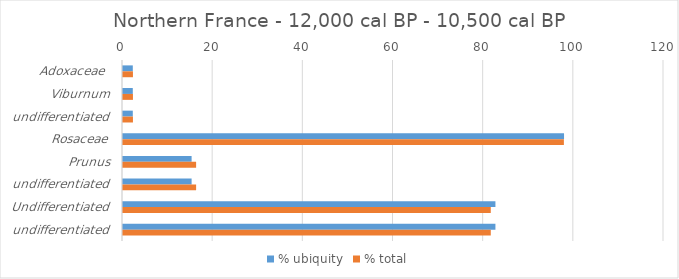
| Category | % ubiquity | % total |
|---|---|---|
| Adoxaceae  | 2.174 | 2.206 |
| Viburnum | 2.174 | 2.206 |
| undifferentiated | 2.174 | 2.206 |
| Rosaceae | 97.826 | 97.794 |
| Prunus | 15.217 | 16.217 |
| undifferentiated | 15.217 | 16.217 |
| Undifferentiated | 82.609 | 81.577 |
| undifferentiated | 82.609 | 81.577 |